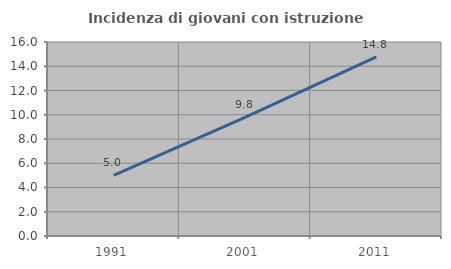
| Category | Incidenza di giovani con istruzione universitaria |
|---|---|
| 1991.0 | 5 |
| 2001.0 | 9.774 |
| 2011.0 | 14.765 |